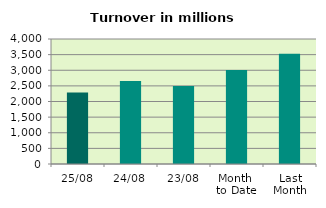
| Category | Series 0 |
|---|---|
| 25/08 | 2285.688 |
| 24/08 | 2657.329 |
| 23/08 | 2498.408 |
| Month 
to Date | 3008.517 |
| Last
Month | 3531.02 |